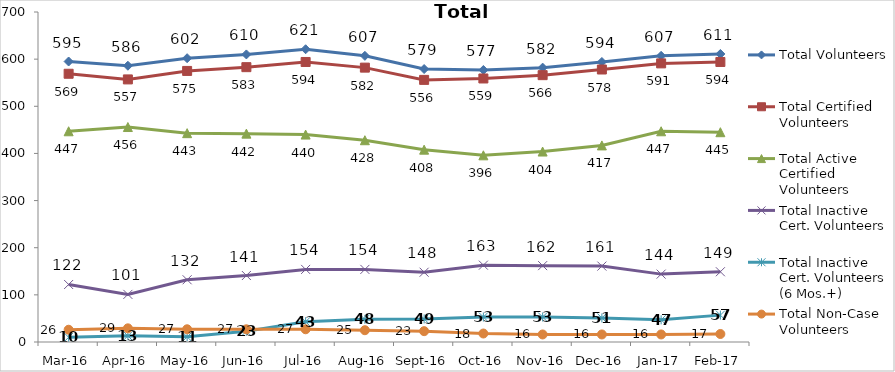
| Category | Total Volunteers | Total Certified Volunteers | Total Active Certified Volunteers | Total Inactive Cert. Volunteers | Total Inactive Cert. Volunteers (6 Mos.+) | Total Non-Case Volunteers |
|---|---|---|---|---|---|---|
| Mar-16 | 595 | 569 | 447 | 122 | 10 | 26 |
| Apr-16 | 586 | 557 | 456 | 101 | 13 | 29 |
| May-16 | 602 | 575 | 443 | 132 | 11 | 27 |
| Jun-16 | 610 | 583 | 442 | 141 | 23 | 27 |
| Jul-16 | 621 | 594 | 440 | 154 | 43 | 27 |
| Aug-16 | 607 | 582 | 428 | 154 | 48 | 25 |
| Sep-16 | 579 | 556 | 408 | 148 | 49 | 23 |
| Oct-16 | 577 | 559 | 396 | 163 | 53 | 18 |
| Nov-16 | 582 | 566 | 404 | 162 | 53 | 16 |
| Dec-16 | 594 | 578 | 417 | 161 | 51 | 16 |
| Jan-17 | 607 | 591 | 447 | 144 | 47 | 16 |
| Feb-17 | 611 | 594 | 445 | 149 | 57 | 17 |